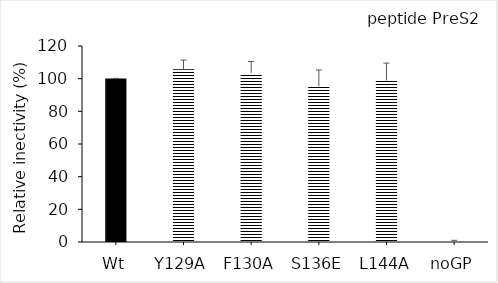
| Category | Series 0 |
|---|---|
| Wt | 100.062 |
| Y129A | 105.77 |
| F130A | 103.507 |
| S136E | 95.386 |
| L144A | 98.926 |
| noGP | 0.573 |